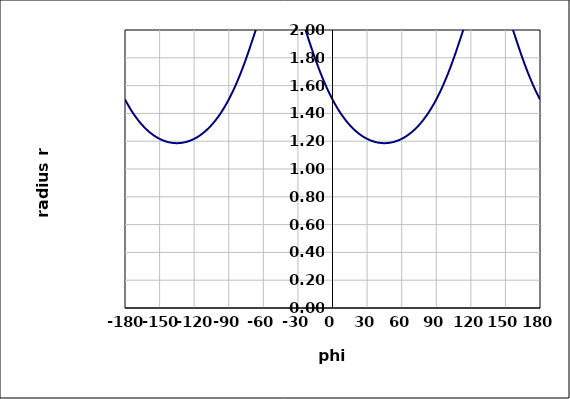
| Category | Series 0 |
|---|---|
| -180.0 | 1.5 |
| -176.0 | 1.441 |
| -172.0 | 1.389 |
| -168.0 | 1.345 |
| -164.0 | 1.307 |
| -160.0 | 1.274 |
| -156.0 | 1.247 |
| -152.0 | 1.226 |
| -148.0 | 1.209 |
| -144.0 | 1.197 |
| -140.0 | 1.189 |
| -136.0 | 1.186 |
| -132.0 | 1.187 |
| -128.0 | 1.193 |
| -124.0 | 1.202 |
| -120.0 | 1.217 |
| -116.0 | 1.236 |
| -112.0 | 1.26 |
| -108.0 | 1.29 |
| -104.0 | 1.325 |
| -100.0 | 1.366 |
| -96.0 | 1.414 |
| -92.0 | 1.47 |
| -88.0 | 1.532 |
| -84.0 | 1.603 |
| -80.0 | 1.683 |
| -76.0 | 1.77 |
| -72.0 | 1.864 |
| -68.0 | 1.964 |
| -64.0 | 2.066 |
| -60.0 | 2.164 |
| -56.0 | 2.252 |
| -52.0 | 2.321 |
| -48.0 | 2.362 |
| -44.0 | 2.371 |
| -40.0 | 2.345 |
| -36.0 | 2.289 |
| -32.0 | 2.21 |
| -28.0 | 2.116 |
| -24.0 | 2.015 |
| -20.0 | 1.914 |
| -16.0 | 1.816 |
| -12.0 | 1.725 |
| -8.0 | 1.642 |
| -4.0 | 1.567 |
| 0.0 | 1.5 |
| 4.0 | 1.441 |
| 8.0 | 1.389 |
| 12.0 | 1.345 |
| 16.0 | 1.307 |
| 20.0 | 1.274 |
| 24.0 | 1.247 |
| 28.0 | 1.226 |
| 32.0 | 1.209 |
| 36.0 | 1.197 |
| 40.0 | 1.189 |
| 44.0 | 1.186 |
| 48.0 | 1.187 |
| 52.0 | 1.193 |
| 56.0 | 1.202 |
| 60.0 | 1.217 |
| 64.0 | 1.236 |
| 68.0 | 1.26 |
| 72.0 | 1.29 |
| 76.0 | 1.325 |
| 80.0 | 1.366 |
| 84.0 | 1.414 |
| 88.0 | 1.47 |
| 92.0 | 1.532 |
| 96.0 | 1.603 |
| 100.0 | 1.683 |
| 104.0 | 1.77 |
| 108.0 | 1.864 |
| 112.0 | 1.964 |
| 116.0 | 2.066 |
| 120.0 | 2.164 |
| 124.0 | 2.252 |
| 128.0 | 2.321 |
| 132.0 | 2.362 |
| 136.0 | 2.371 |
| 140.0 | 2.345 |
| 144.0 | 2.289 |
| 148.0 | 2.21 |
| 152.0 | 2.116 |
| 156.0 | 2.015 |
| 160.0 | 1.914 |
| 164.0 | 1.816 |
| 168.0 | 1.725 |
| 172.0 | 1.642 |
| 176.0 | 1.567 |
| 180.0 | 1.5 |